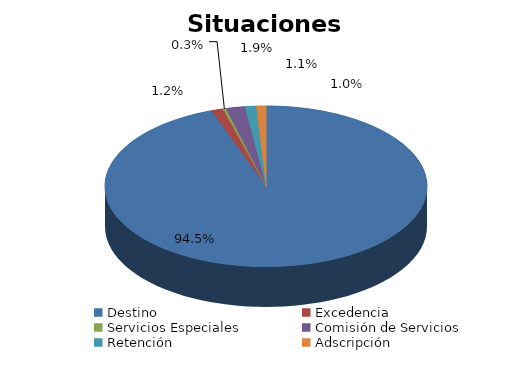
| Category | Series 0 |
|---|---|
| Destino | 2430 |
| Excedencia | 30 |
| Servicios Especiales | 8 |
| Comisión de Servicios | 49 |
| Retención | 29 |
| Adscripción | 25 |